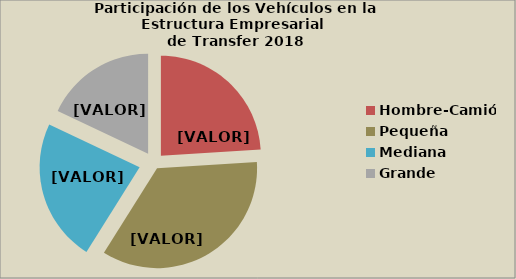
| Category | Series 0 |
|---|---|
| Hombre-Camión | 24.002 |
| Pequeña | 34.884 |
| Mediana | 23.1 |
| Grande | 17.958 |